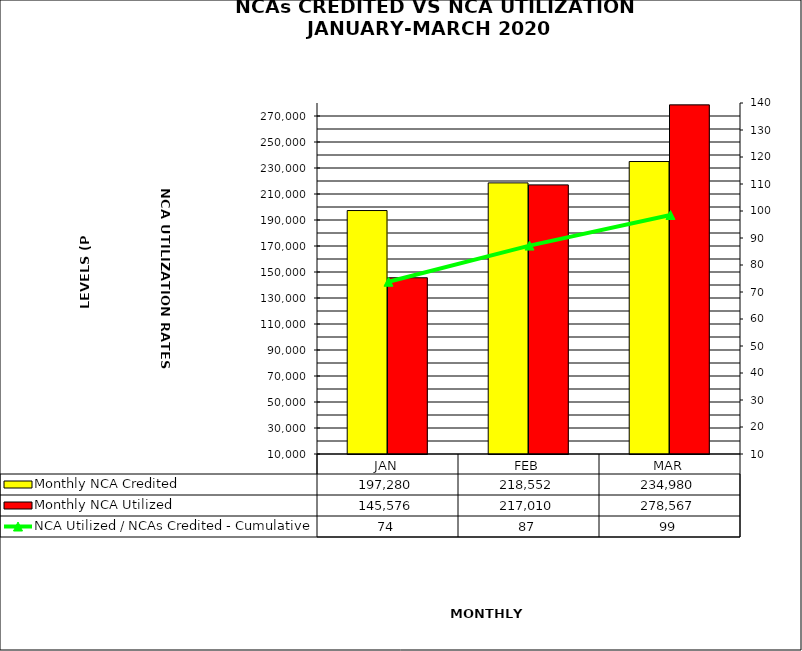
| Category | Monthly NCA Credited | Monthly NCA Utilized |
|---|---|---|
| JAN | 197280.374 | 145576.104 |
| FEB | 218551.98 | 217009.914 |
| MAR | 234979.638 | 278567.462 |